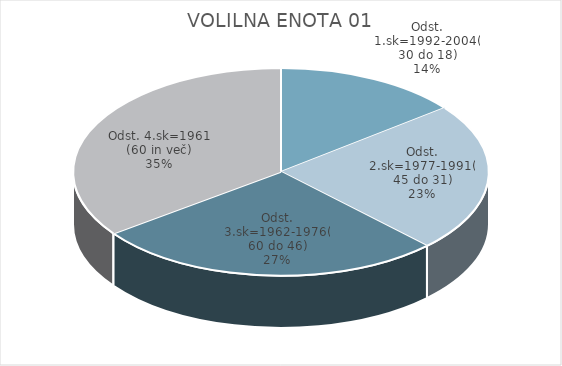
| Category | VOLILNA ENOTA 1 |
|---|---|
| Odst. 1.sk=1992-2004(30 do 18) | 10.53 |
| Odst. 2.sk=1977-1991(45 do 31) | 16.94 |
| Odst. 3.sk=1962-1976(60 do 46) | 19.91 |
| Odst. 4.sk=1961 (60 in več) | 25.63 |